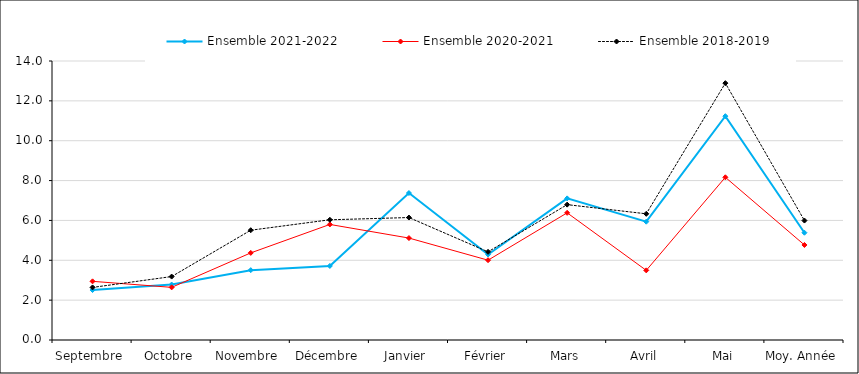
| Category | Ensemble |
|---|---|
| Septembre | 2.638 |
| Octobre | 3.183 |
| Novembre | 5.509 |
| Décembre | 6.032 |
| Janvier | 6.145 |
| Février | 4.424 |
| Mars | 6.793 |
| Avril | 6.332 |
| Mai | 12.888 |
| Moy. Année | 5.994 |